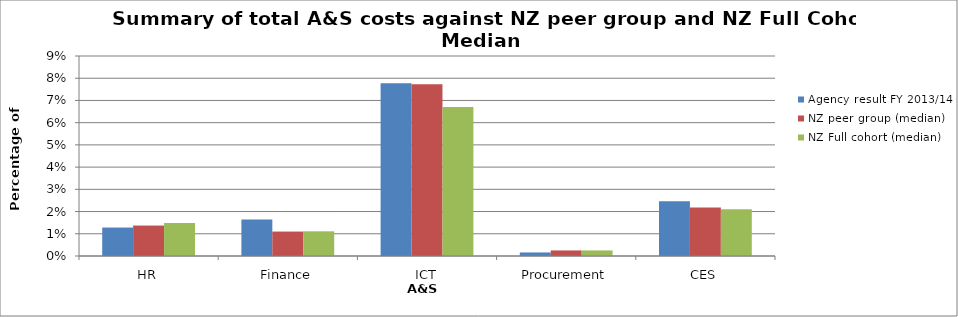
| Category | Agency result FY 2013/14 | NZ peer group (median) | NZ Full cohort (median) |
|---|---|---|---|
| HR | 0.013 | 0.014 | 0.015 |
| Finance | 0.016 | 0.011 | 0.011 |
| ICT | 0.078 | 0.077 | 0.067 |
| Procurement | 0.002 | 0.002 | 0.002 |
| CES | 0.025 | 0.022 | 0.021 |